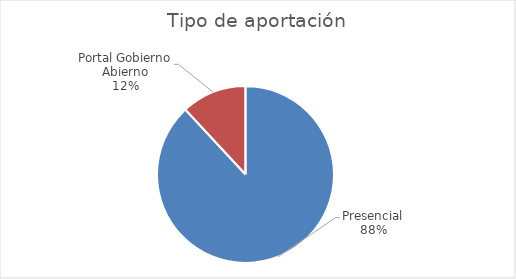
| Category | Series 0 |
|---|---|
| Presencial | 37 |
| Portal Gobierno Abierno | 5 |